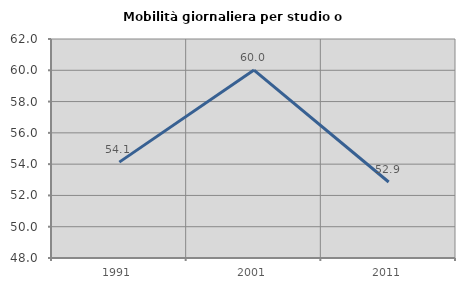
| Category | Mobilità giornaliera per studio o lavoro |
|---|---|
| 1991.0 | 54.129 |
| 2001.0 | 60.016 |
| 2011.0 | 52.858 |